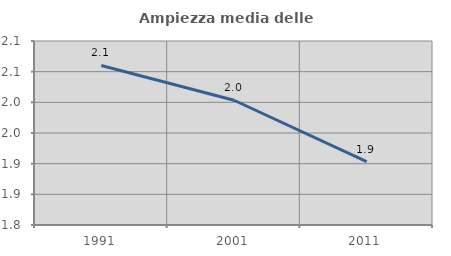
| Category | Ampiezza media delle famiglie |
|---|---|
| 1991.0 | 2.06 |
| 2001.0 | 2.003 |
| 2011.0 | 1.903 |